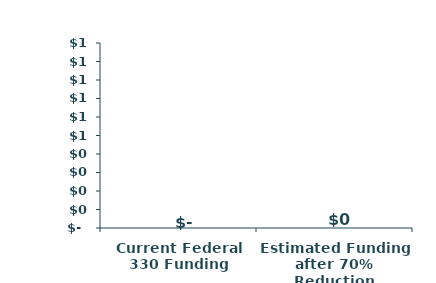
| Category | Funding |
|---|---|
| Current Federal 330 Funding | 0 |
| Estimated Funding after 70% Reduction | 0 |